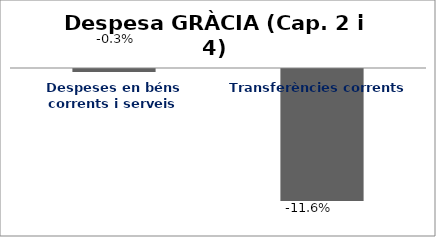
| Category | Series 0 |
|---|---|
| Despeses en béns corrents i serveis | -0.003 |
| Transferències corrents | -0.116 |